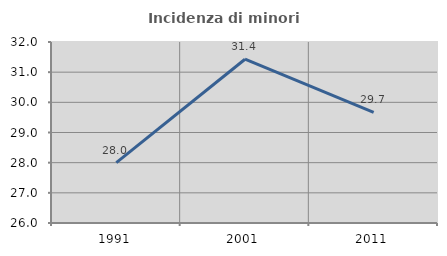
| Category | Incidenza di minori stranieri |
|---|---|
| 1991.0 | 28 |
| 2001.0 | 31.429 |
| 2011.0 | 29.668 |